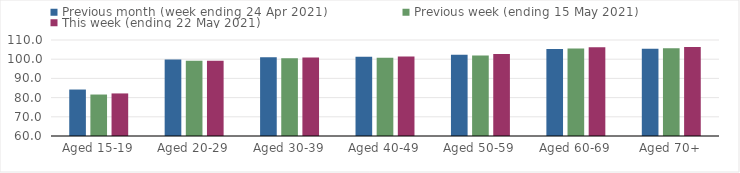
| Category | Previous month (week ending 24 Apr 2021) | Previous week (ending 15 May 2021) | This week (ending 22 May 2021) |
|---|---|---|---|
| Aged 15-19 | 84.2 | 81.6 | 82.17 |
| Aged 20-29 | 99.84 | 99.16 | 99.21 |
| Aged 30-39 | 101.08 | 100.51 | 100.83 |
| Aged 40-49 | 101.24 | 100.74 | 101.4 |
| Aged 50-59 | 102.35 | 101.94 | 102.69 |
| Aged 60-69 | 105.36 | 105.59 | 106.26 |
| Aged 70+ | 105.47 | 105.75 | 106.34 |